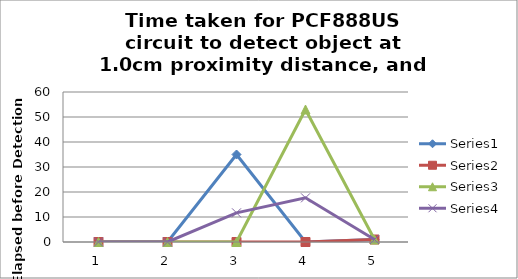
| Category | Series 0 | Series 1 | Series 2 | Series 3 |
|---|---|---|---|---|
| 0 | 0 | 0 | 0 | 0 |
| 1 | 0 | 0 | 0 | 0 |
| 2 | 35 | 0 | 0 | 11.667 |
| 3 | 0 | 0 | 53 | 17.667 |
| 4 | 1 | 1 | 1 | 1 |